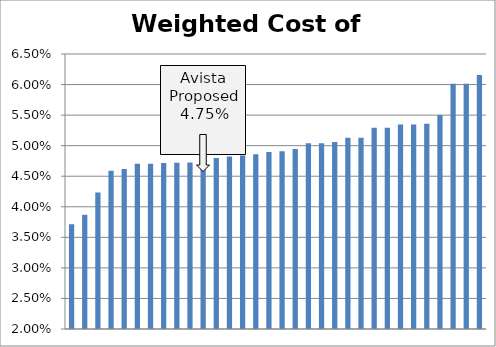
| Category | Series 0 |
|---|---|
| 0 | 0.037 |
| 1 | 0.039 |
| 2 | 0.042 |
| 3 | 0.046 |
| 4 | 0.046 |
| 5 | 0.047 |
| 6 | 0.047 |
| 7 | 0.047 |
| 8 | 0.047 |
| 9 | 0.047 |
| 10 | 0.047 |
| 11 | 0.048 |
| 12 | 0.048 |
| 13 | 0.048 |
| 14 | 0.049 |
| 15 | 0.049 |
| 16 | 0.049 |
| 17 | 0.049 |
| 18 | 0.05 |
| 19 | 0.05 |
| 20 | 0.051 |
| 21 | 0.051 |
| 22 | 0.051 |
| 23 | 0.053 |
| 24 | 0.053 |
| 25 | 0.053 |
| 26 | 0.053 |
| 27 | 0.054 |
| 28 | 0.055 |
| 29 | 0.06 |
| 30 | 0.06 |
| 31 | 0.062 |